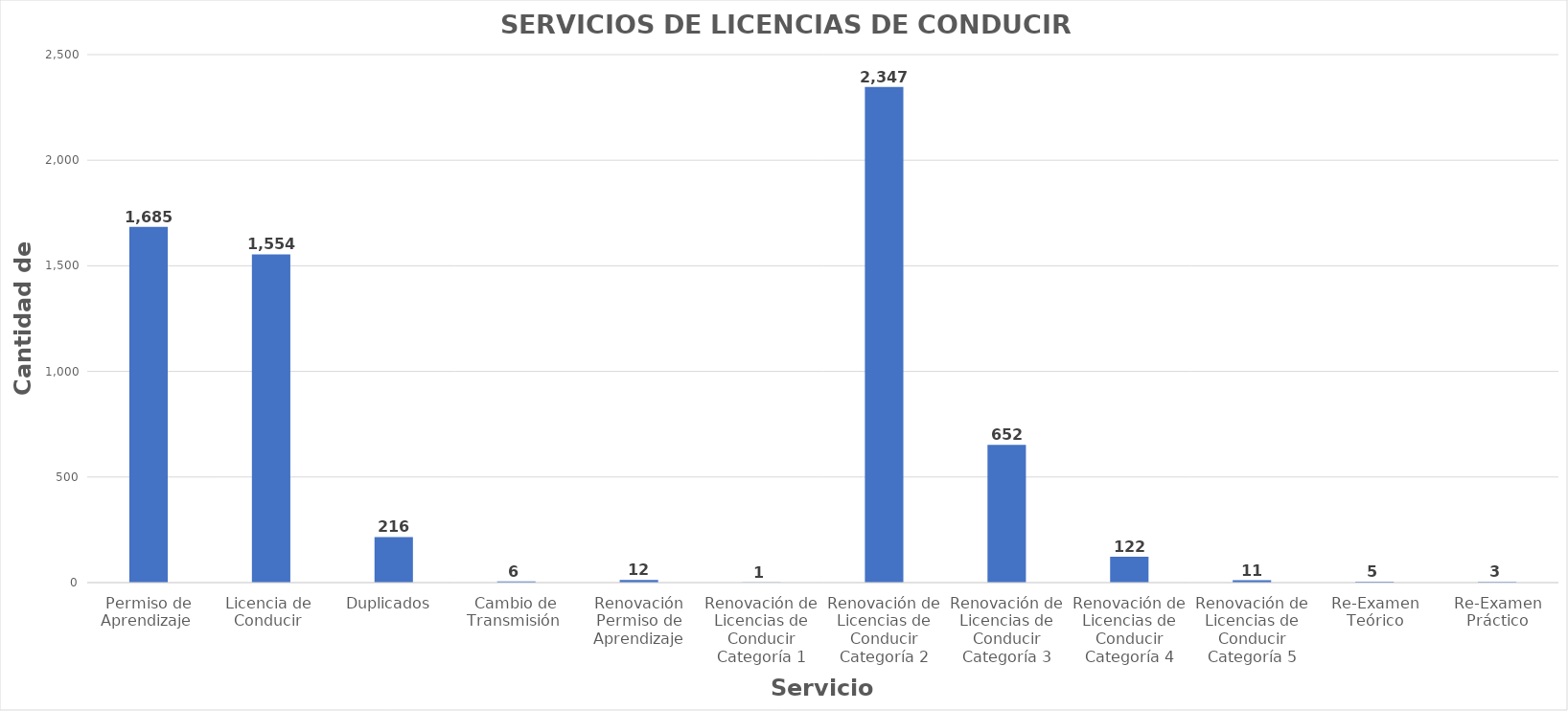
| Category | Series 0 |
|---|---|
| Permiso de Aprendizaje  | 1685 |
| Licencia de  Conducir  | 1554 |
| Duplicados  | 216 |
| Cambio de Transmisión  | 6 |
| Renovación Permiso de Aprendizaje | 12 |
| Renovación de Licencias de Conducir Categoría 1 | 1 |
| Renovación de Licencias de Conducir Categoría 2 | 2347 |
| Renovación de Licencias de Conducir Categoría 3 | 652 |
| Renovación de Licencias de Conducir Categoría 4 | 122 |
| Renovación de Licencias de Conducir Categoría 5 | 11 |
| Re-Examen Teórico | 5 |
| Re-Examen Práctico | 3 |